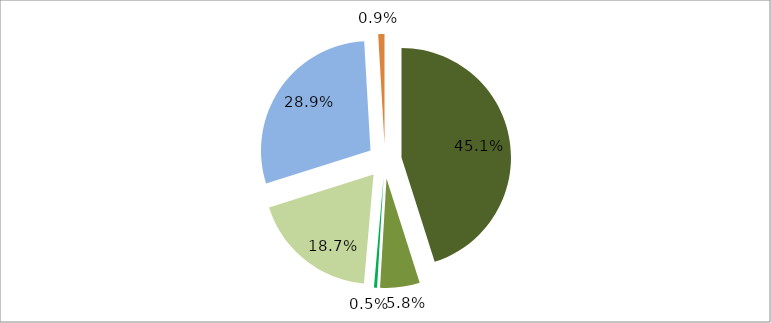
| Category | Series 0 |
|---|---|
| 0 | 0.451 |
| 1 | 0.058 |
| 2 | 0.005 |
| 3 | 0.187 |
| 4 | 0.289 |
| 5 | 0.009 |